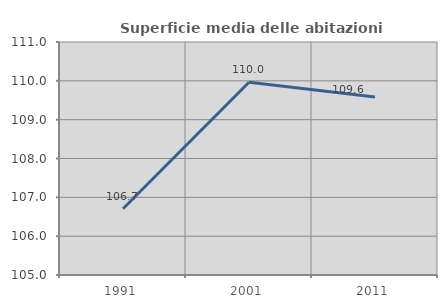
| Category | Superficie media delle abitazioni occupate |
|---|---|
| 1991.0 | 106.706 |
| 2001.0 | 109.962 |
| 2011.0 | 109.582 |